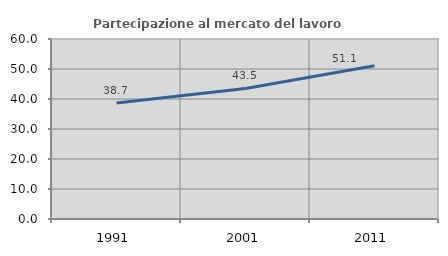
| Category | Partecipazione al mercato del lavoro  femminile |
|---|---|
| 1991.0 | 38.678 |
| 2001.0 | 43.512 |
| 2011.0 | 51.082 |